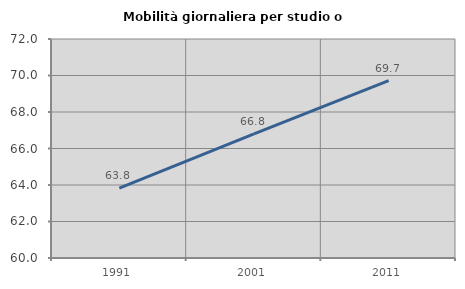
| Category | Mobilità giornaliera per studio o lavoro |
|---|---|
| 1991.0 | 63.832 |
| 2001.0 | 66.802 |
| 2011.0 | 69.724 |